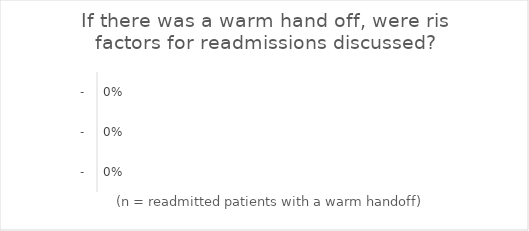
| Category | Series 0 |
|---|---|
| - | 0 |
| - | 0 |
| - | 0 |